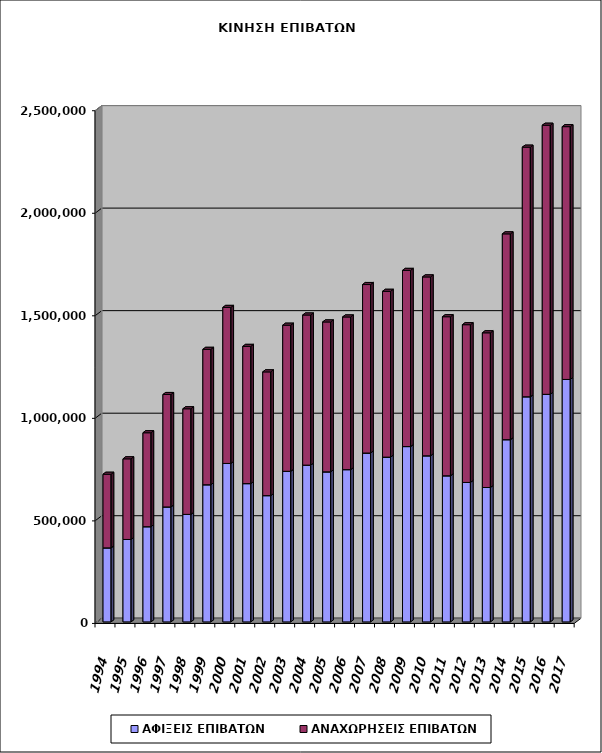
| Category | ΑΦΙΞΕΙΣ ΕΠΙΒΑΤΩΝ | ΑΝΑΧΩΡΗΣΕΙΣ ΕΠΙΒΑΤΩΝ |
|---|---|---|
| 1994.0 | 360883 | 358963 |
| 1995.0 | 401962 | 393123 |
| 1996.0 | 464067 | 458123 |
| 1997.0 | 560568 | 548168 |
| 1998.0 | 524232 | 514917 |
| 1999.0 | 668697 | 660279 |
| 2000.0 | 772548 | 760835 |
| 2001.0 | 674213 | 669153 |
| 2002.0 | 615650 | 603413 |
| 2003.0 | 734298 | 712379 |
| 2004.0 | 764369 | 732042 |
| 2005.0 | 731537 | 730968 |
| 2006.0 | 742424 | 744409 |
| 2007.0 | 823410 | 821540 |
| 2008.0 | 803444 | 808439 |
| 2009.0 | 854827 | 859063 |
| 2010.0 | 809869 | 872202 |
| 2011.0 | 712390 | 775582 |
| 2012.0 | 679977 | 769139 |
| 2013.0 | 655359 | 754249 |
| 2014.0 | 888459 | 1003559 |
| 2015.0 | 1097676 | 1217097 |
| 2016.0 | 1109598 | 1312124 |
| 2017.0 | 1182135 | 1232664 |